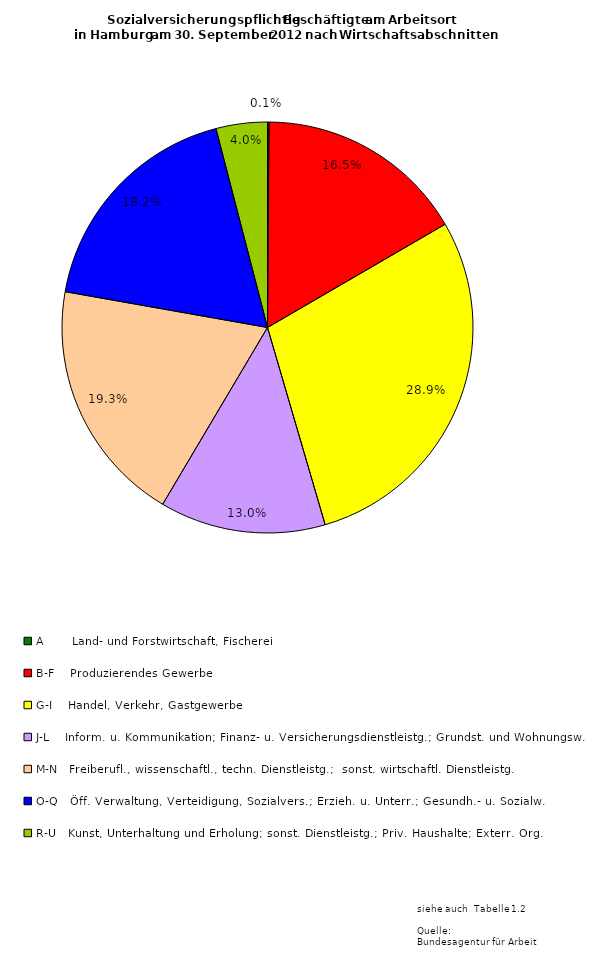
| Category | Series 0 | Series 1 | Series 2 |
|---|---|---|---|
| A       Land- und Forstwirtschaft, Fischerei | 982 | 274 | 708 |
| B-F    Produzierendes Gewerbe | 143594 | 30935 | 112659 |
| G-I    Handel, Verkehr, Gastgewerbe | 250932 | 106176 | 144756 |
| J-L    Inform. u. Kommunikation; Finanz- u. Versicherungsdienstleistg.; Grundst. und Wohnungsw. | 113483 | 51190 | 62293 |
| M-N   Freiberufl., wissenschaftl., techn. Dienstleistg.;  sonst. wirtschaftl. Dienstleistg.  | 167623 | 81317 | 86306 |
| O-Q   Öff. Verwaltung, Verteidigung, Sozialvers.; Erzieh. u. Unterr.; Gesundh.- u. Sozialw. | 158083 | 112753 | 45330 |
| R-U   Kunst, Unterhaltung und Erholung; sonst. Dienstleistg.; Priv. Haushalte; Exterr. Org. | 35112 | 20855 | 14257 |